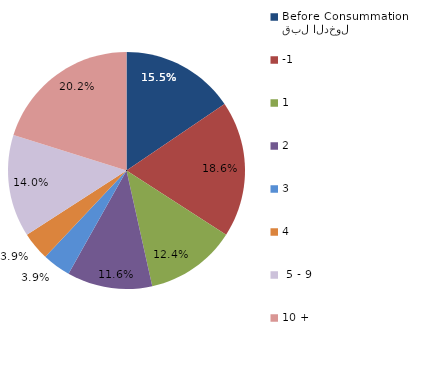
| Category | Series 0 |
|---|---|
| قبل الدخول
Before Consummation | 15.504 |
| -1 | 18.605 |
| 1 | 12.403 |
| 2 | 11.628 |
| 3 | 3.876 |
| 4 | 3.876 |
|  5 - 9 | 13.953 |
| 10 + | 20.155 |